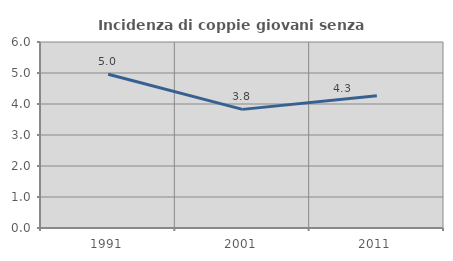
| Category | Incidenza di coppie giovani senza figli |
|---|---|
| 1991.0 | 4.959 |
| 2001.0 | 3.827 |
| 2011.0 | 4.264 |